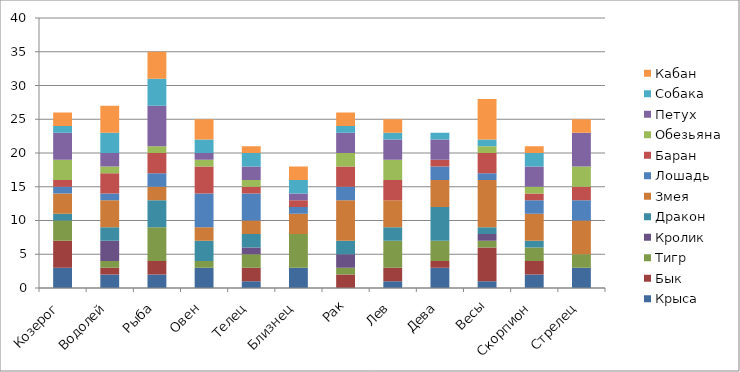
| Category | Крыса | Бык | Тигр | Кролик | Дракон | Змея | Лошадь  | Баран | Обезьяна | Петух | Собака | Кабан |
|---|---|---|---|---|---|---|---|---|---|---|---|---|
| Козерог | 3 | 4 | 3 | 0 | 1 | 3 | 1 | 1 | 3 | 4 | 1 | 2 |
| Водолей | 2 | 1 | 1 | 3 | 2 | 4 | 1 | 3 | 1 | 2 | 3 | 4 |
| Рыба | 2 | 2 | 5 | 0 | 4 | 2 | 2 | 3 | 1 | 6 | 4 | 4 |
| Овен | 3 | 0 | 1 | 0 | 3 | 2 | 5 | 4 | 1 | 1 | 2 | 3 |
| Телец | 1 | 2 | 2 | 1 | 2 | 2 | 4 | 1 | 1 | 2 | 2 | 1 |
| Близнец | 3 | 0 | 5 | 0 | 0 | 3 | 1 | 1 | 0 | 1 | 2 | 2 |
| Рак | 0 | 2 | 1 | 2 | 2 | 6 | 2 | 3 | 2 | 3 | 1 | 2 |
| Лев | 1 | 2 | 4 | 0 | 2 | 4 | 0 | 3 | 3 | 3 | 1 | 2 |
| Дева | 3 | 1 | 3 | 0 | 5 | 4 | 2 | 1 | 0 | 3 | 1 | 0 |
| Весы | 1 | 5 | 1 | 1 | 1 | 7 | 1 | 3 | 1 | 0 | 1 | 6 |
| Скорпион | 2 | 2 | 2 | 0 | 1 | 4 | 2 | 1 | 1 | 3 | 2 | 1 |
| Стрелец | 3 | 0 | 2 | 0 | 0 | 5 | 3 | 2 | 3 | 5 | 0 | 2 |